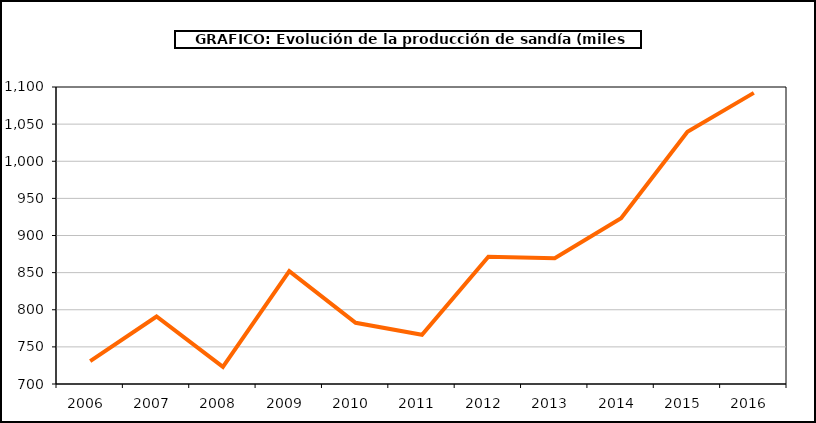
| Category | producción |
|---|---|
| 2006.0 | 730.902 |
| 2007.0 | 790.947 |
| 2008.0 | 723.164 |
| 2009.0 | 851.976 |
| 2010.0 | 782.43 |
| 2011.0 | 766.301 |
| 2012.0 | 871.324 |
| 2013.0 | 869.499 |
| 2014.0 | 923.32 |
| 2015.0 | 1039.698 |
| 2016.0 | 1092.075 |